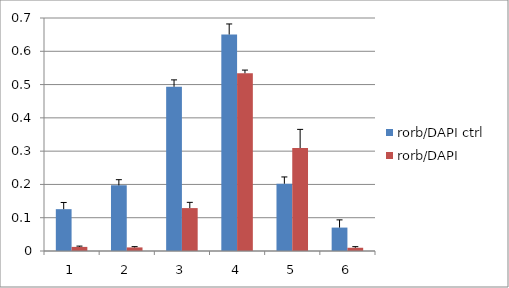
| Category | rorb/DAPI ctrl  | rorb/DAPI |
|---|---|---|
| 0 | 0.126 | 0.012 |
| 1 | 0.197 | 0.011 |
| 2 | 0.493 | 0.129 |
| 3 | 0.65 | 0.534 |
| 4 | 0.202 | 0.309 |
| 5 | 0.07 | 0.01 |